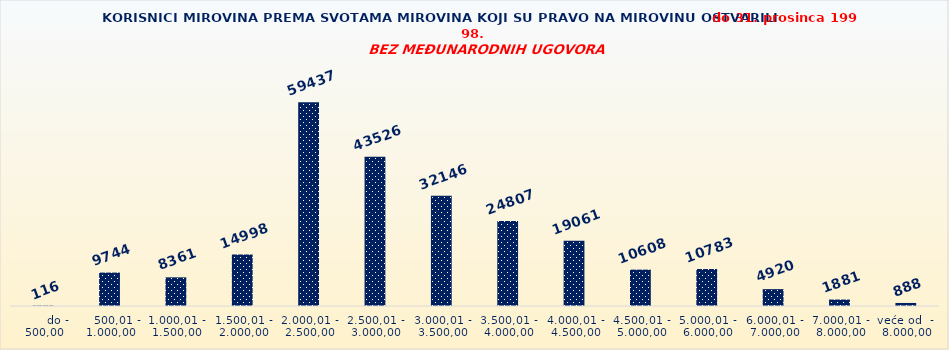
| Category | Series 0 |
|---|---|
|       do - 500,00 | 116 |
|    500,01 - 1.000,00 | 9744 |
| 1.000,01 - 1.500,00 | 8361 |
| 1.500,01 - 2.000,00 | 14998 |
| 2.000,01 - 2.500,00 | 59437 |
| 2.500,01 - 3.000,00 | 43526 |
| 3.000,01 - 3.500,00 | 32146 |
| 3.500,01 - 4.000,00 | 24807 |
| 4.000,01 - 4.500,00 | 19061 |
| 4.500,01 - 5.000,00 | 10608 |
| 5.000,01 - 6.000,00 | 10783 |
| 6.000,01 - 7.000,00 | 4920 |
| 7.000,01 - 8.000,00 | 1881 |
| veće od  -  8.000,00 | 888 |